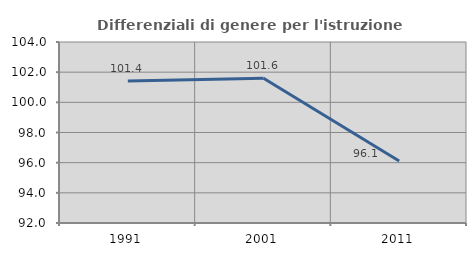
| Category | Differenziali di genere per l'istruzione superiore |
|---|---|
| 1991.0 | 101.419 |
| 2001.0 | 101.596 |
| 2011.0 | 96.111 |